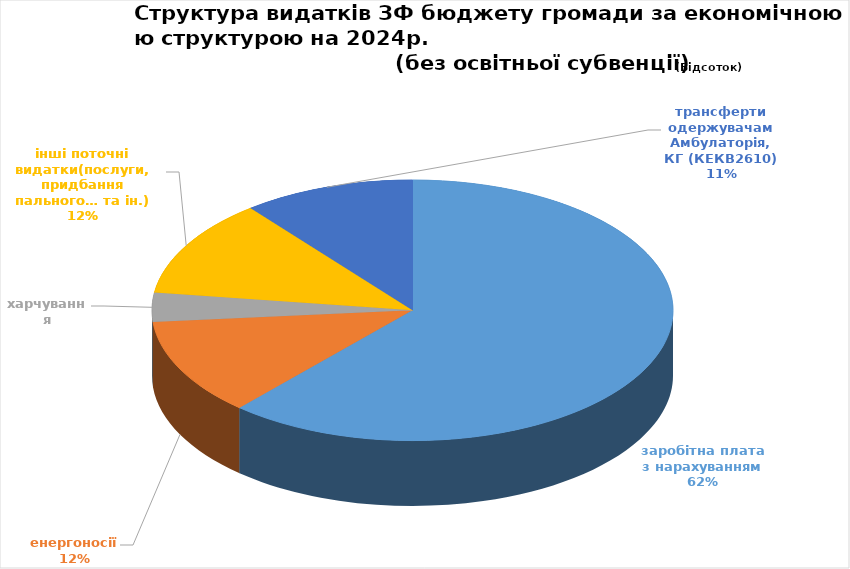
| Category | Series 0 | Series 1 |
|---|---|---|
| заробітна плата з нарахуванням | 12797693 | 61.552 |
| енергоносії  | 2496402 | 12.007 |
| харчування | 750000 | 3.607 |
| інші поточні видатки(послуги, придбання пального… та ін.) | 2530445 | 12.17 |
| трансферти одержувачам Амбулаторія, КГ (КЕКВ2610) | 2217234 | 10.664 |